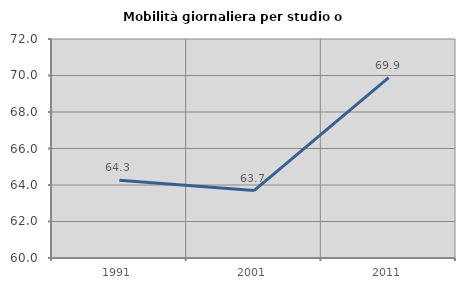
| Category | Mobilità giornaliera per studio o lavoro |
|---|---|
| 1991.0 | 64.262 |
| 2001.0 | 63.695 |
| 2011.0 | 69.883 |